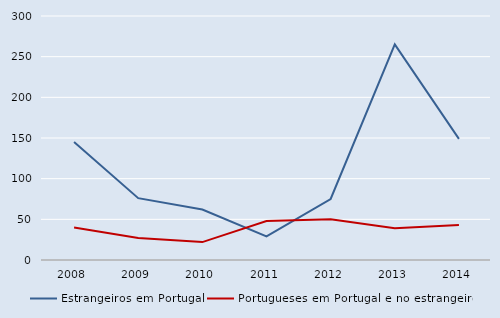
| Category | Estrangeiros em Portugal | Portugueses em Portugal e no estrangeiro |
|---|---|---|
| 2008.0 | 145 | 40 |
| 2009.0 | 76 | 27 |
| 2010.0 | 62 | 22 |
| 2011.0 | 29 | 48 |
| 2012.0 | 75 | 50 |
| 2013.0 | 265 | 39 |
| 2014.0 | 149 | 43 |